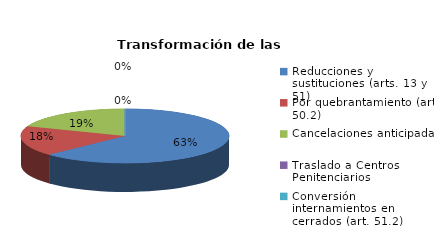
| Category | Series 0 |
|---|---|
| Reducciones y sustituciones (arts. 13 y 51) | 56 |
| Por quebrantamiento (art. 50.2) | 16 |
| Cancelaciones anticipadas | 17 |
| Traslado a Centros Penitenciarios | 0 |
| Conversión internamientos en cerrados (art. 51.2) | 0 |